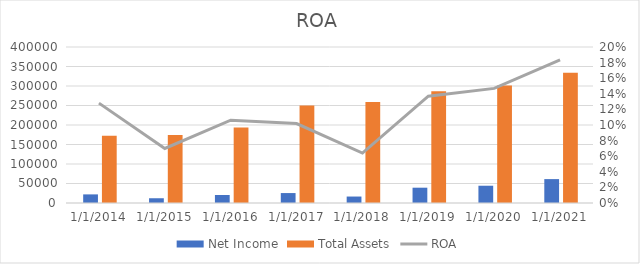
| Category | Net Income | Total Assets |
|---|---|---|
| 12/31/14 | 22074 | 172384 |
| 12/31/15 | 12193 | 174472 |
| 12/31/16 | 20539 | 193468 |
| 12/31/17 | 25489 | 250312 |
| 12/31/18 | 16571 | 258848 |
| 12/31/19 | 39240 | 286556 |
| 12/31/20 | 44281 | 301311 |
| 12/31/21 | 61271 | 333779 |